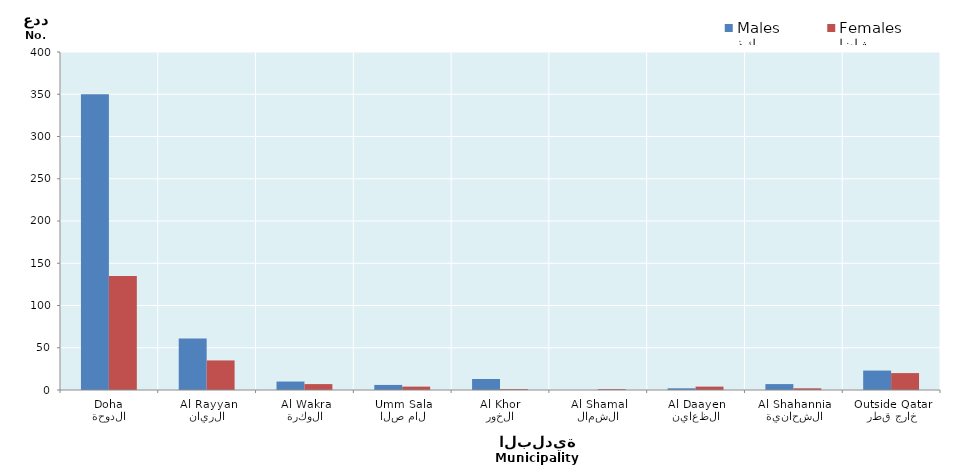
| Category | ذكور
Males | إناث
Females |
|---|---|---|
| الدوحة
Doha | 350 | 135 |
| الريان
Al Rayyan | 61 | 35 |
| الوكرة
Al Wakra | 10 | 7 |
| ام صلال
Umm Salal | 6 | 4 |
| الخور
Al Khor | 13 | 1 |
| الشمال
Al Shamal | 0 | 1 |
| الظعاين
Al Daayen | 2 | 4 |
| الشحانية
Al Shahannia | 7 | 2 |
| خارج قطر
Outside Qatar | 23 | 20 |